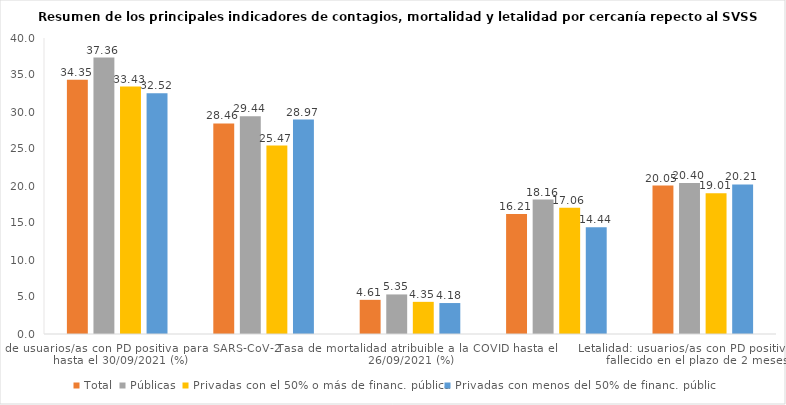
| Category | Total | Públicas | Privadas con el 50% o más de financ. pública | Privadas con menos del 50% de financ. pública |
|---|---|---|---|---|
| Tasa de usuarios/as con PD positiva para SARS-CoV-2 hasta el 30/09/2021 (%) | 34.355 | 37.361 | 33.434 | 32.52 |
| Tasa de mortalidad por todas las causas hasta el 26/09/2021 (%) | 28.461 | 29.441 | 25.471 | 28.97 |
| Tasa de mortalidad atribuible a la COVID hasta el 26/09/2021 (%) | 4.614 | 5.348 | 4.345 | 4.184 |
| Proporción de los fallecimientos totales atribuibles a la COVID hasta el 26/09/2021 (%) | 16.21 | 18.163 | 17.059 | 14.442 |
| Letalidad: usuarios/as con PD positiva que han fallecido en el plazo de 2 meses (%) | 20.055 | 20.397 | 19.014 | 20.206 |